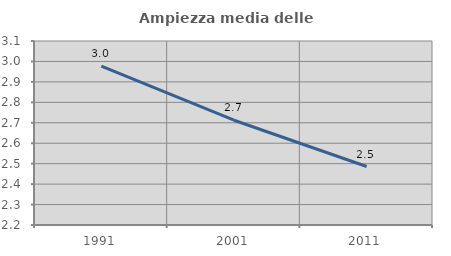
| Category | Ampiezza media delle famiglie |
|---|---|
| 1991.0 | 2.977 |
| 2001.0 | 2.712 |
| 2011.0 | 2.486 |